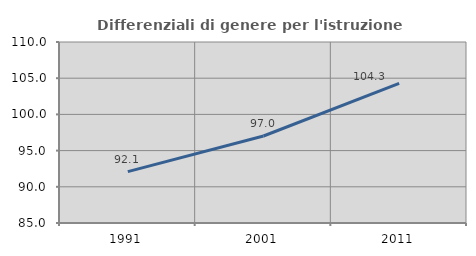
| Category | Differenziali di genere per l'istruzione superiore |
|---|---|
| 1991.0 | 92.101 |
| 2001.0 | 97.015 |
| 2011.0 | 104.299 |